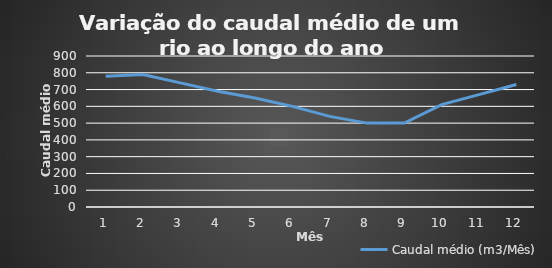
| Category | Caudal médio (m3/Mês) |
|---|---|
| 0 | 780 |
| 1 | 790 |
| 2 | 740 |
| 3 | 690 |
| 4 | 650 |
| 5 | 600 |
| 6 | 540 |
| 7 | 500 |
| 8 | 500 |
| 9 | 610 |
| 10 | 670 |
| 11 | 730 |